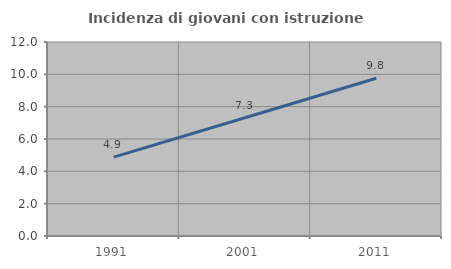
| Category | Incidenza di giovani con istruzione universitaria |
|---|---|
| 1991.0 | 4.878 |
| 2001.0 | 7.317 |
| 2011.0 | 9.756 |